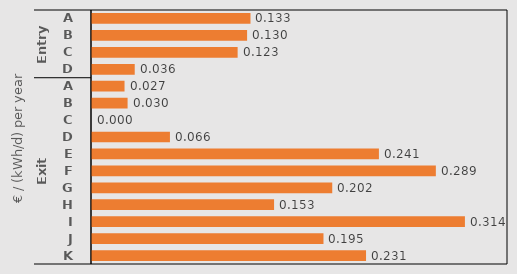
| Category | Pre-equalization prices |
|---|---|
| 0 | 0.133 |
| 1 | 0.13 |
| 2 | 0.123 |
| 3 | 0.036 |
| 4 | 0.027 |
| 5 | 0.03 |
| 6 | 0 |
| 7 | 0.066 |
| 8 | 0.241 |
| 9 | 0.289 |
| 10 | 0.202 |
| 11 | 0.153 |
| 12 | 0.314 |
| 13 | 0.195 |
| 14 | 0.231 |